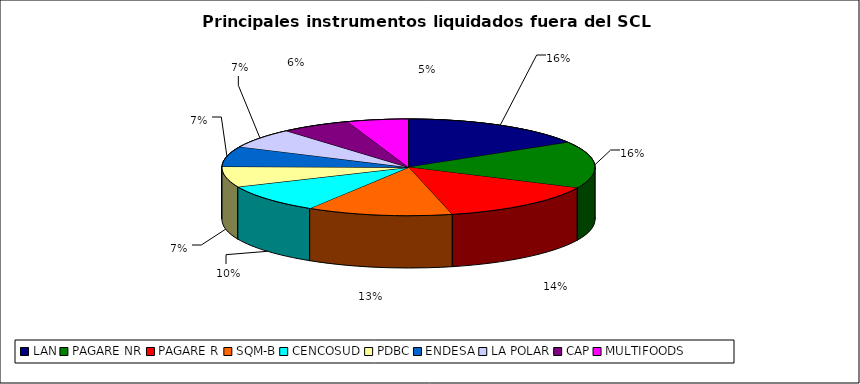
| Category | Series 0 |
|---|---|
| LAN | 1730 |
| PAGARE NR | 1657 |
| PAGARE R | 1502 |
| SQM-B | 1337 |
| CENCOSUD | 1006 |
| PDBC | 728 |
| ENDESA | 714 |
| LA POLAR | 698 |
| CAP | 642 |
| MULTIFOODS | 559 |